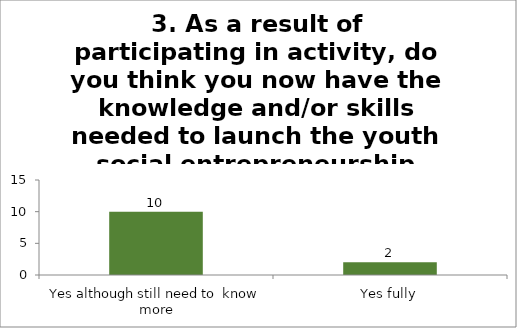
| Category | 3. As a result of participating in activity, do you think you now have the knowledge and/or skills needed to launch the youth social entrepreneurship competition in your institution? |
|---|---|
| Yes although still need to  know more | 10 |
| Yes fully | 2 |